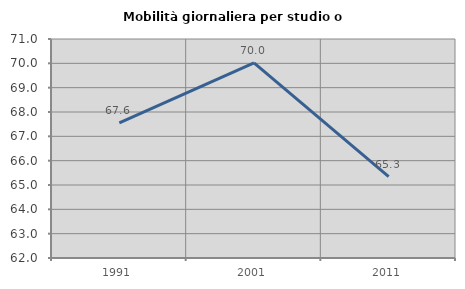
| Category | Mobilità giornaliera per studio o lavoro |
|---|---|
| 1991.0 | 67.552 |
| 2001.0 | 70.017 |
| 2011.0 | 65.347 |